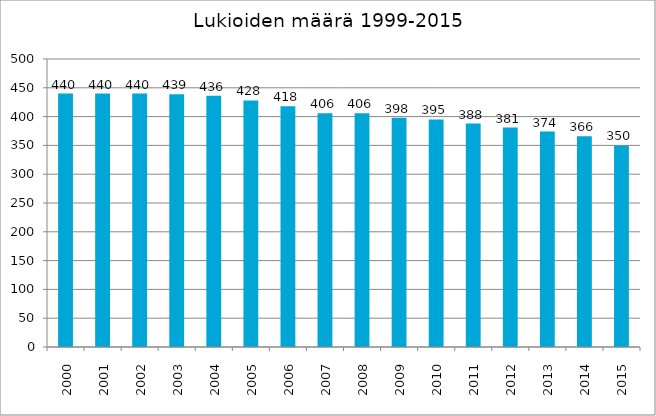
| Category | Lukioiden määrä* |
|---|---|
| 2000.0 | 440 |
| 2001.0 | 440 |
| 2002.0 | 440 |
| 2003.0 | 439 |
| 2004.0 | 436 |
| 2005.0 | 428 |
| 2006.0 | 418 |
| 2007.0 | 406 |
| 2008.0 | 406 |
| 2009.0 | 398 |
| 2010.0 | 395 |
| 2011.0 | 388 |
| 2012.0 | 381 |
| 2013.0 | 374 |
| 2014.0 | 366 |
| 2015.0 | 350 |